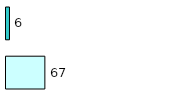
| Category | Series 0 | Series 1 |
|---|---|---|
| 0 | 67 | 6 |